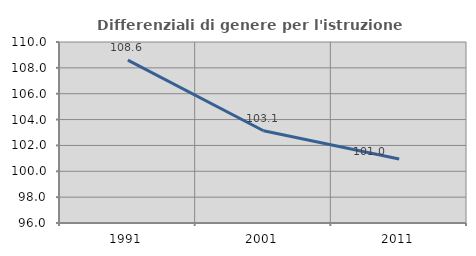
| Category | Differenziali di genere per l'istruzione superiore |
|---|---|
| 1991.0 | 108.594 |
| 2001.0 | 103.133 |
| 2011.0 | 100.952 |